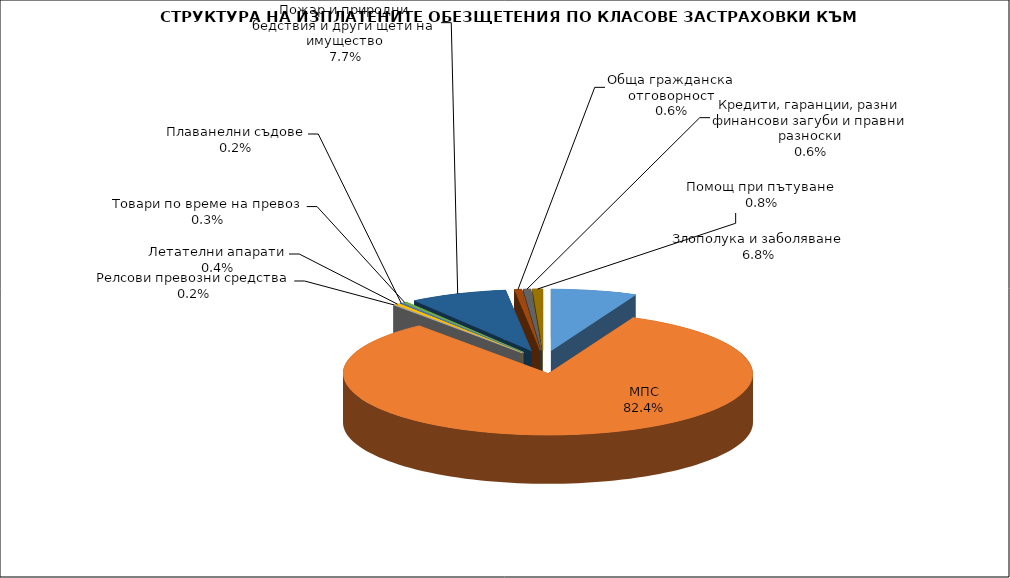
| Category | Злополука и заболяване |
|---|---|
| Злополука и заболяване | 0.068 |
| МПС | 0.824 |
| Релсови превозни средства | 0.002 |
| Летателни апарати | 0.004 |
| Плаванелни съдове | 0.002 |
| Товари по време на превоз | 0.003 |
| Пожар и природни бедствия и други щети на имущество | 0.077 |
| Обща гражданска отговорност | 0.006 |
| Кредити, гаранции, разни финансови загуби и правни разноски | 0.006 |
| Помощ при пътуване | 0.008 |